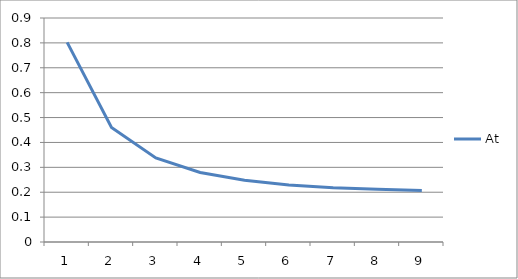
| Category | At |
|---|---|
| 0 | 0.802 |
| 1 | 0.46 |
| 2 | 0.338 |
| 3 | 0.279 |
| 4 | 0.248 |
| 5 | 0.229 |
| 6 | 0.218 |
| 7 | 0.212 |
| 8 | 0.207 |